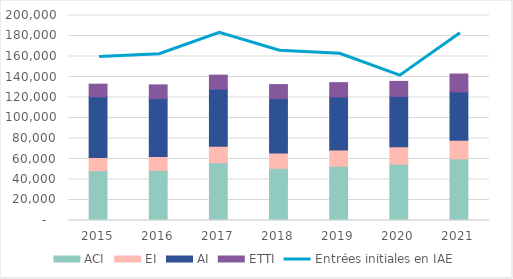
| Category | ACI | EI | AI | ETTI |
|---|---|---|---|---|
| 2015.0 | 48500 | 13000 | 59200 | 12300 |
| 2016.0 | 48900 | 13600 | 56500 | 13300 |
| 2017.0 | 56300 | 16100 | 55800 | 13600 |
| 2018.0 | 50900 | 15000 | 53100 | 13600 |
| 2019.0 | 53000 | 15800 | 51800 | 13900 |
| 2020.0 | 54900 | 17000 | 49200 | 14600 |
| 2021.0 | 60200 | 18100 | 47200 | 17400 |